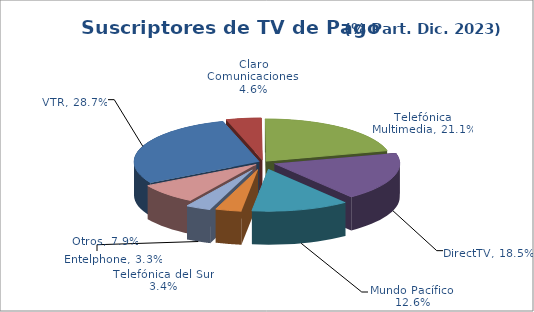
| Category | Series 0 |
|---|---|
| VTR | 0.287 |
| Claro Comunicaciones | 0.046 |
| Telefónica Multimedia | 0.211 |
| DirectTV | 0.185 |
| Mundo Pacífico | 0.126 |
| Telefónica del Sur | 0.034 |
| Entelphone | 0.033 |
| Otros | 0.079 |